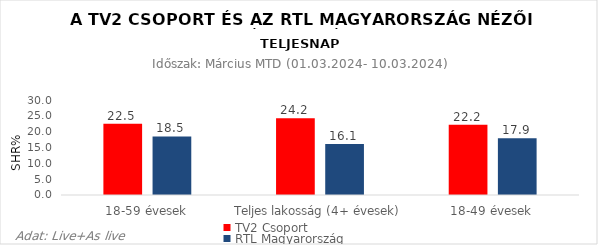
| Category | TV2 Csoport | RTL Magyarország |
|---|---|---|
| 18-59 évesek | 22.5 | 18.5 |
| Teljes lakosság (4+ évesek) | 24.2 | 16.1 |
| 18-49 évesek | 22.2 | 17.9 |